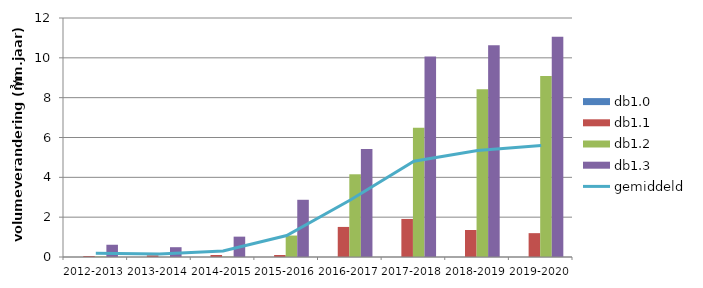
| Category | db1.0 | db1.1 | db1.2 | db1.3 |
|---|---|---|---|---|
| 2012-2013 | 0 | 0.052 | 0.023 | 0.615 |
| 2013-2014 | 0 | 0.084 | 0.002 | 0.492 |
| 2014-2015 | 0 | 0.101 | 0.014 | 1.022 |
| 2015-2016 | 0 | 0.1 | 1.077 | 2.873 |
| 2016-2017 | 0 | 1.51 | 4.153 | 5.42 |
| 2017-2018 | 0 | 1.911 | 6.493 | 10.069 |
| 2018-2019 | 0 | 1.355 | 8.425 | 10.629 |
| 2019-2020 | 0 | 1.197 | 9.085 | 11.062 |